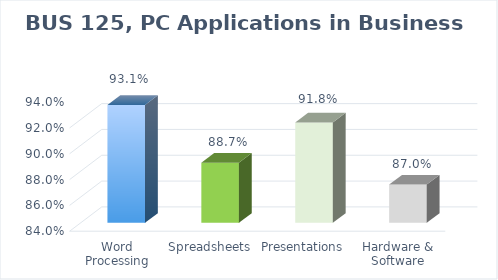
| Category | Series 0 |
|---|---|
| Word Processing | 0.931 |
| Spreadsheets | 0.887 |
| Presentations | 0.918 |
| Hardware & Software | 0.87 |